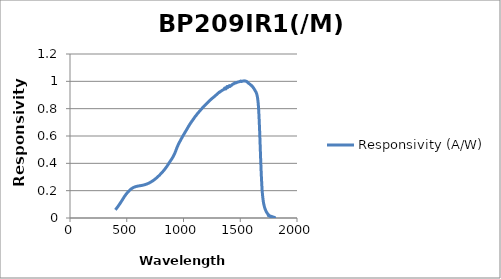
| Category | Responsivity (A/W) |
|---|---|
| 400.0 | 0.06 |
| 405.0 | 0.065 |
| 410.0 | 0.07 |
| 415.0 | 0.076 |
| 420.0 | 0.081 |
| 425.0 | 0.087 |
| 430.0 | 0.093 |
| 435.0 | 0.099 |
| 440.0 | 0.105 |
| 445.0 | 0.112 |
| 450.0 | 0.118 |
| 455.0 | 0.124 |
| 460.0 | 0.131 |
| 465.0 | 0.138 |
| 470.0 | 0.144 |
| 475.0 | 0.151 |
| 480.0 | 0.157 |
| 485.0 | 0.163 |
| 490.0 | 0.169 |
| 495.0 | 0.175 |
| 500.0 | 0.18 |
| 505.0 | 0.185 |
| 510.0 | 0.19 |
| 515.0 | 0.194 |
| 520.0 | 0.199 |
| 525.0 | 0.203 |
| 530.0 | 0.206 |
| 535.0 | 0.21 |
| 540.0 | 0.213 |
| 545.0 | 0.216 |
| 550.0 | 0.219 |
| 555.0 | 0.221 |
| 560.0 | 0.223 |
| 565.0 | 0.225 |
| 570.0 | 0.227 |
| 575.0 | 0.228 |
| 580.0 | 0.23 |
| 585.0 | 0.231 |
| 590.0 | 0.232 |
| 595.0 | 0.233 |
| 600.0 | 0.234 |
| 605.0 | 0.234 |
| 610.0 | 0.235 |
| 615.0 | 0.236 |
| 620.0 | 0.237 |
| 625.0 | 0.237 |
| 630.0 | 0.238 |
| 635.0 | 0.239 |
| 640.0 | 0.24 |
| 645.0 | 0.241 |
| 650.0 | 0.242 |
| 655.0 | 0.243 |
| 660.0 | 0.244 |
| 665.0 | 0.245 |
| 670.0 | 0.247 |
| 675.0 | 0.248 |
| 680.0 | 0.25 |
| 685.0 | 0.252 |
| 690.0 | 0.254 |
| 695.0 | 0.255 |
| 700.0 | 0.258 |
| 705.0 | 0.26 |
| 710.0 | 0.262 |
| 715.0 | 0.264 |
| 720.0 | 0.267 |
| 725.0 | 0.27 |
| 730.0 | 0.272 |
| 735.0 | 0.275 |
| 740.0 | 0.278 |
| 745.0 | 0.282 |
| 750.0 | 0.285 |
| 755.0 | 0.288 |
| 760.0 | 0.292 |
| 765.0 | 0.295 |
| 770.0 | 0.299 |
| 775.0 | 0.303 |
| 780.0 | 0.307 |
| 785.0 | 0.311 |
| 790.0 | 0.315 |
| 795.0 | 0.319 |
| 800.0 | 0.323 |
| 805.0 | 0.328 |
| 810.0 | 0.332 |
| 815.0 | 0.337 |
| 820.0 | 0.342 |
| 825.0 | 0.347 |
| 830.0 | 0.352 |
| 835.0 | 0.357 |
| 840.0 | 0.362 |
| 845.0 | 0.368 |
| 850.0 | 0.374 |
| 855.0 | 0.38 |
| 860.0 | 0.386 |
| 865.0 | 0.392 |
| 870.0 | 0.399 |
| 875.0 | 0.405 |
| 880.0 | 0.412 |
| 885.0 | 0.418 |
| 890.0 | 0.424 |
| 895.0 | 0.43 |
| 900.0 | 0.437 |
| 905.0 | 0.444 |
| 910.0 | 0.451 |
| 915.0 | 0.459 |
| 920.0 | 0.468 |
| 925.0 | 0.477 |
| 930.0 | 0.488 |
| 935.0 | 0.499 |
| 940.0 | 0.509 |
| 945.0 | 0.52 |
| 950.0 | 0.529 |
| 955.0 | 0.539 |
| 960.0 | 0.547 |
| 965.0 | 0.555 |
| 970.0 | 0.563 |
| 975.0 | 0.571 |
| 980.0 | 0.578 |
| 985.0 | 0.586 |
| 990.0 | 0.593 |
| 995.0 | 0.601 |
| 1000.0 | 0.608 |
| 1005.0 | 0.615 |
| 1010.0 | 0.622 |
| 1015.0 | 0.629 |
| 1020.0 | 0.636 |
| 1025.0 | 0.643 |
| 1030.0 | 0.65 |
| 1035.0 | 0.657 |
| 1040.0 | 0.664 |
| 1045.0 | 0.672 |
| 1050.0 | 0.678 |
| 1055.0 | 0.685 |
| 1060.0 | 0.691 |
| 1065.0 | 0.698 |
| 1070.0 | 0.703 |
| 1075.0 | 0.71 |
| 1080.0 | 0.715 |
| 1085.0 | 0.721 |
| 1090.0 | 0.727 |
| 1095.0 | 0.733 |
| 1100.0 | 0.739 |
| 1105.0 | 0.745 |
| 1110.0 | 0.749 |
| 1115.0 | 0.755 |
| 1120.0 | 0.76 |
| 1125.0 | 0.766 |
| 1130.0 | 0.77 |
| 1135.0 | 0.775 |
| 1140.0 | 0.78 |
| 1145.0 | 0.784 |
| 1150.0 | 0.79 |
| 1155.0 | 0.794 |
| 1160.0 | 0.799 |
| 1165.0 | 0.804 |
| 1170.0 | 0.808 |
| 1175.0 | 0.813 |
| 1180.0 | 0.817 |
| 1185.0 | 0.822 |
| 1190.0 | 0.825 |
| 1195.0 | 0.829 |
| 1200.0 | 0.833 |
| 1205.0 | 0.838 |
| 1210.0 | 0.841 |
| 1215.0 | 0.847 |
| 1220.0 | 0.85 |
| 1225.0 | 0.855 |
| 1230.0 | 0.858 |
| 1235.0 | 0.863 |
| 1240.0 | 0.866 |
| 1245.0 | 0.87 |
| 1250.0 | 0.873 |
| 1255.0 | 0.877 |
| 1260.0 | 0.88 |
| 1265.0 | 0.884 |
| 1270.0 | 0.887 |
| 1275.0 | 0.891 |
| 1280.0 | 0.895 |
| 1285.0 | 0.899 |
| 1290.0 | 0.902 |
| 1295.0 | 0.906 |
| 1300.0 | 0.909 |
| 1305.0 | 0.914 |
| 1310.0 | 0.916 |
| 1315.0 | 0.921 |
| 1320.0 | 0.921 |
| 1325.0 | 0.925 |
| 1330.0 | 0.928 |
| 1335.0 | 0.931 |
| 1340.0 | 0.933 |
| 1345.0 | 0.936 |
| 1350.0 | 0.938 |
| 1355.0 | 0.941 |
| 1360.0 | 0.947 |
| 1365.0 | 0.952 |
| 1370.0 | 0.945 |
| 1375.0 | 0.946 |
| 1380.0 | 0.958 |
| 1385.0 | 0.962 |
| 1390.0 | 0.955 |
| 1395.0 | 0.958 |
| 1400.0 | 0.965 |
| 1405.0 | 0.969 |
| 1410.0 | 0.963 |
| 1415.0 | 0.966 |
| 1420.0 | 0.97 |
| 1425.0 | 0.972 |
| 1430.0 | 0.977 |
| 1435.0 | 0.98 |
| 1440.0 | 0.98 |
| 1445.0 | 0.983 |
| 1450.0 | 0.987 |
| 1455.0 | 0.99 |
| 1460.0 | 0.989 |
| 1465.0 | 0.99 |
| 1470.0 | 0.992 |
| 1475.0 | 0.993 |
| 1480.0 | 0.995 |
| 1485.0 | 0.996 |
| 1490.0 | 0.997 |
| 1495.0 | 0.998 |
| 1500.0 | 1 |
| 1505.0 | 1.002 |
| 1510.0 | 0.999 |
| 1515.0 | 1 |
| 1520.0 | 1.001 |
| 1525.0 | 1.002 |
| 1530.0 | 1.003 |
| 1535.0 | 1.004 |
| 1540.0 | 1.002 |
| 1545.0 | 1.002 |
| 1550.0 | 1.001 |
| 1555.0 | 1 |
| 1560.0 | 0.996 |
| 1565.0 | 0.994 |
| 1570.0 | 0.988 |
| 1575.0 | 0.985 |
| 1580.0 | 0.982 |
| 1585.0 | 0.979 |
| 1590.0 | 0.976 |
| 1595.0 | 0.971 |
| 1600.0 | 0.969 |
| 1605.0 | 0.963 |
| 1610.0 | 0.96 |
| 1615.0 | 0.953 |
| 1620.0 | 0.948 |
| 1625.0 | 0.941 |
| 1630.0 | 0.934 |
| 1635.0 | 0.926 |
| 1640.0 | 0.918 |
| 1645.0 | 0.908 |
| 1650.0 | 0.891 |
| 1655.0 | 0.863 |
| 1660.0 | 0.82 |
| 1665.0 | 0.75 |
| 1670.0 | 0.654 |
| 1675.0 | 0.541 |
| 1680.0 | 0.426 |
| 1685.0 | 0.323 |
| 1690.0 | 0.241 |
| 1695.0 | 0.181 |
| 1700.0 | 0.14 |
| 1705.0 | 0.112 |
| 1710.0 | 0.092 |
| 1715.0 | 0.077 |
| 1720.0 | 0.064 |
| 1725.0 | 0.054 |
| 1730.0 | 0.046 |
| 1735.0 | 0.038 |
| 1740.0 | 0.032 |
| 1745.0 | 0.027 |
| 1750.0 | 0.023 |
| 1755.0 | 0.019 |
| 1760.0 | 0.016 |
| 1765.0 | 0.014 |
| 1770.0 | 0.012 |
| 1775.0 | 0.01 |
| 1780.0 | 0.009 |
| 1785.0 | 0.007 |
| 1790.0 | 0.006 |
| 1795.0 | 0.005 |
| 1800.0 | 0.005 |
| 1750.0 | 0.018 |
| 1755.0 | 0.015 |
| 1760.0 | 0.013 |
| 1765.0 | 0.011 |
| 1770.0 | 0.009 |
| 1775.0 | 0.008 |
| 1780.0 | 0.007 |
| 1785.0 | 0.006 |
| 1790.0 | 0.005 |
| 1795.0 | 0.004 |
| 1800.0 | 0.004 |